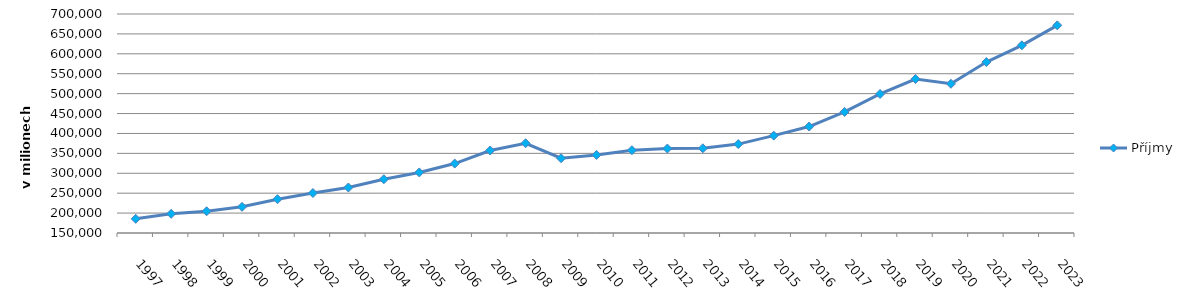
| Category | Příjmy |
|---|---|
| 1997.0 | 185536 |
| 1998.0 | 198130 |
| 1999.0 | 204553 |
| 2000.0 | 215714 |
| 2001.0 | 234814.549 |
| 2002.0 | 250348.776 |
| 2003.0 | 264208 |
| 2004.0 | 285063.585 |
| 2005.0 | 302085.434 |
| 2006.0 | 324349.868 |
| 2007.0 | 357209.569 |
| 2008.0 | 375367.744 |
| 2009.0 | 337757.504 |
| 2010.0 | 346101.251 |
| 2011.0 | 357918.769 |
| 2012.0 | 362096.736 |
| 2013.0 | 362757.729 |
| 2014.0 | 373273.424 |
| 2015.0 | 394506.653 |
| 2016.0 | 417316.13 |
| 2017.0 | 454140.097 |
| 2018.0 | 499185.346 |
| 2019.0 | 536721.843 |
| 2020.0 | 524738.898 |
| 2021.0 | 579232.592 |
| 2022.0 | 621393.38 |
| 2023.0 | 671525.912 |